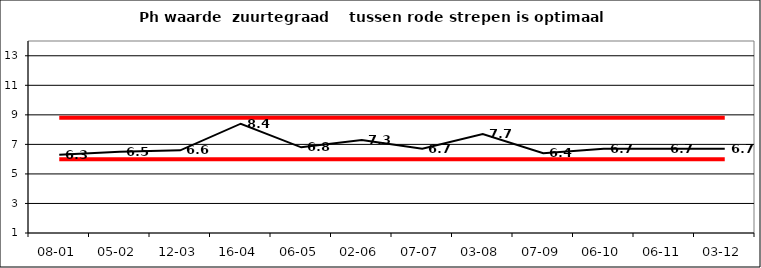
| Category | Series 0 | Series 1 | Series 2 |
|---|---|---|---|
| 08-01 | 8.8 | 6 | 6.3 |
| 05-02 | 8.8 | 6 | 6.5 |
| 12-03 | 8.8 | 6 | 6.6 |
| 16-04 | 8.8 | 6 | 8.4 |
| 06-05 | 8.8 | 6 | 6.8 |
| 02-06 | 8.8 | 6 | 7.3 |
| 07-07 | 8.8 | 6 | 6.7 |
| 03-08 | 8.8 | 6 | 7.7 |
| 07-09 | 8.8 | 6 | 6.4 |
| 06-10 | 8.8 | 6 | 6.7 |
| 06-11 | 8.8 | 6 | 6.7 |
| 03-12 | 8.8 | 6 | 6.7 |